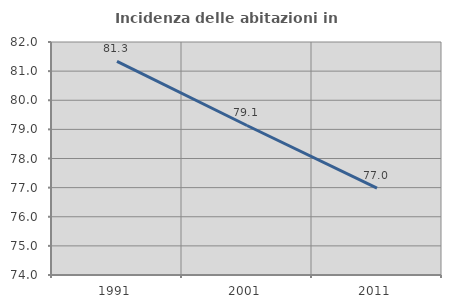
| Category | Incidenza delle abitazioni in proprietà  |
|---|---|
| 1991.0 | 81.333 |
| 2001.0 | 79.134 |
| 2011.0 | 76.981 |